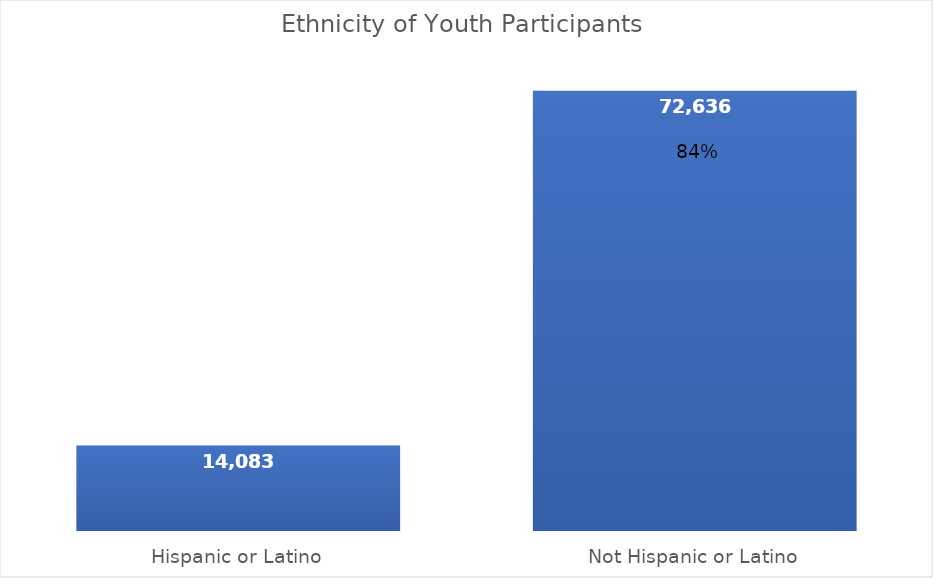
| Category | TOTAL YOUTH |
|---|---|
| Hispanic or Latino | 14083 |
| Not Hispanic or Latino | 72636 |